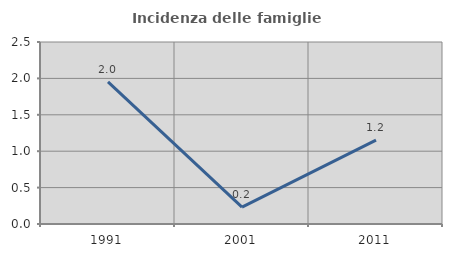
| Category | Incidenza delle famiglie numerose |
|---|---|
| 1991.0 | 1.951 |
| 2001.0 | 0.231 |
| 2011.0 | 1.152 |